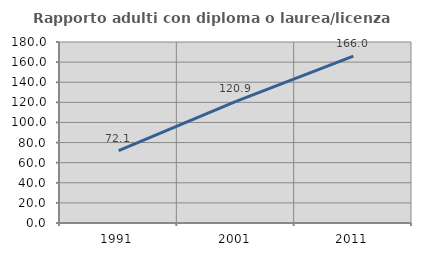
| Category | Rapporto adulti con diploma o laurea/licenza media  |
|---|---|
| 1991.0 | 72.075 |
| 2001.0 | 120.896 |
| 2011.0 | 166.045 |